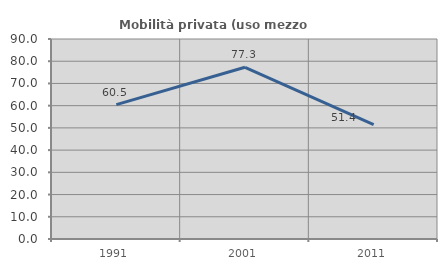
| Category | Mobilità privata (uso mezzo privato) |
|---|---|
| 1991.0 | 60.465 |
| 2001.0 | 77.273 |
| 2011.0 | 51.429 |